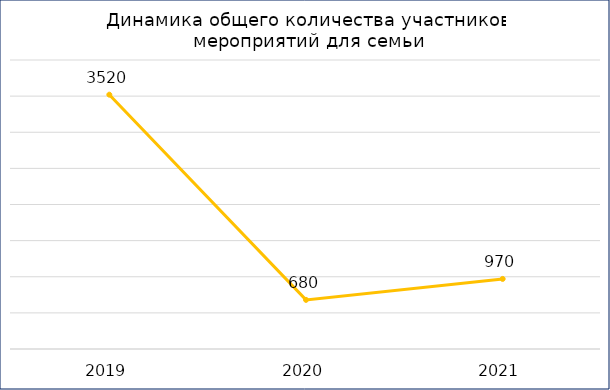
| Category | ИТОГО |
|---|---|
| 2019.0 | 3520 |
| 2020.0 | 680 |
| 2021.0 | 970 |